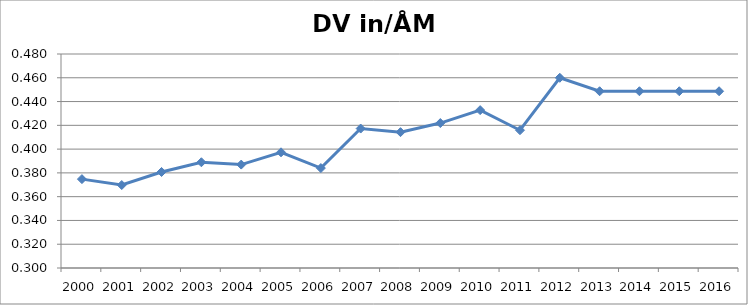
| Category | DV in/ÅM ut |
|---|---|
| 2000.0 | 0.375 |
| 2001.0 | 0.37 |
| 2002.0 | 0.381 |
| 2003.0 | 0.389 |
| 2004.0 | 0.387 |
| 2005.0 | 0.397 |
| 2006.0 | 0.384 |
| 2007.0 | 0.417 |
| 2008.0 | 0.414 |
| 2009.0 | 0.422 |
| 2010.0 | 0.433 |
| 2011.0 | 0.416 |
| 2012.0 | 0.46 |
| 2013.0 | 0.449 |
| 2014.0 | 0.449 |
| 2015.0 | 0.449 |
| 2016.0 | 0.449 |